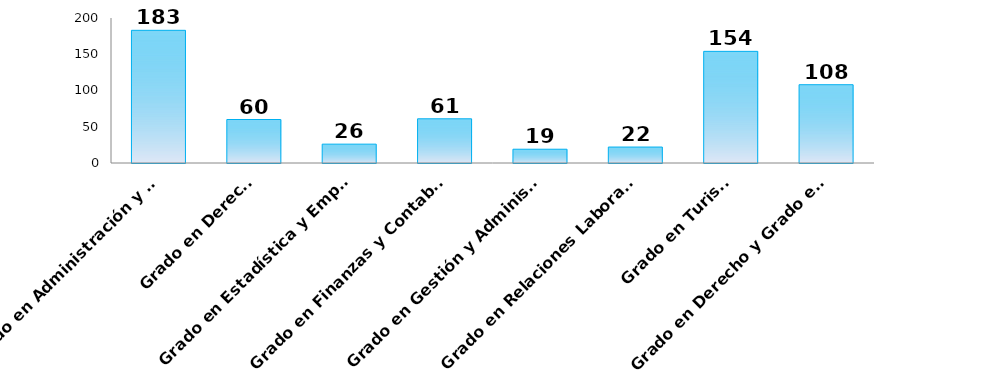
| Category | Series 0 |
|---|---|
| Grado en Administración y Dirección de Empresas | 183 |
| Grado en Derecho | 60 |
| Grado en Estadística y Empresa | 26 |
| Grado en Finanzas y Contabiilidad | 61 |
| Grado en Gestión y Administración Pública | 19 |
| Grado en Relaciones Laborales y Recursos Humanos | 22 |
| Grado en Turismo | 154 |
| Grado en Derecho y Grado en Administración y Dirección de Empresas | 108 |